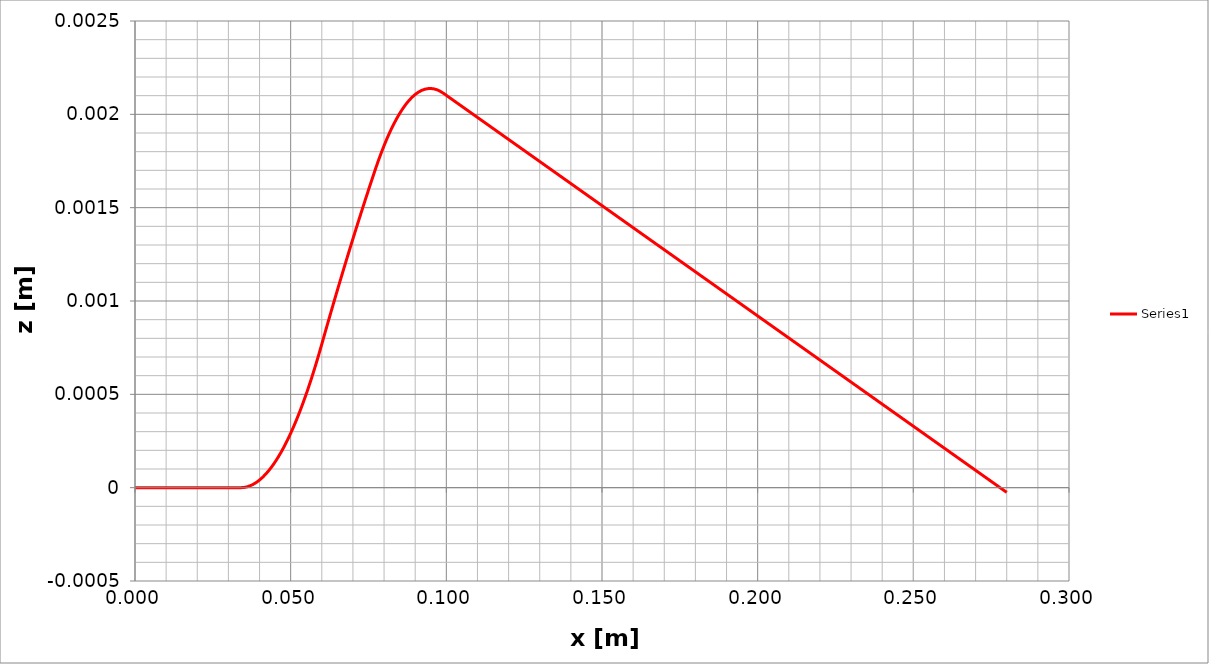
| Category | Series 0 |
|---|---|
| 0.0 | 0 |
| 0.001 | 0 |
| 0.002 | 0 |
| 0.003 | 0 |
| 0.004 | 0 |
| 0.005 | 0 |
| 0.006 | 0 |
| 0.007 | 0 |
| 0.008 | 0 |
| 0.009000000000000001 | 0 |
| 0.010000000000000002 | 0 |
| 0.011000000000000003 | 0 |
| 0.012000000000000004 | 0 |
| 0.013000000000000005 | 0 |
| 0.014000000000000005 | 0 |
| 0.015000000000000006 | 0 |
| 0.016000000000000007 | 0 |
| 0.017000000000000008 | 0 |
| 0.01800000000000001 | 0 |
| 0.01900000000000001 | 0 |
| 0.02000000000000001 | 0 |
| 0.02100000000000001 | 0 |
| 0.022000000000000013 | 0 |
| 0.023000000000000013 | 0 |
| 0.024000000000000014 | 0 |
| 0.025000000000000015 | 0 |
| 0.026000000000000016 | 0 |
| 0.027000000000000017 | 0 |
| 0.028000000000000018 | 0 |
| 0.02900000000000002 | 0 |
| 0.03000000000000002 | 0 |
| 0.03100000000000002 | 0 |
| 0.03200000000000002 | 0 |
| 0.03300000000000002 | 0 |
| 0.03400000000000002 | 0 |
| 0.035000000000000024 | 0 |
| 0.036000000000000025 | 0 |
| 0.037000000000000026 | 0 |
| 0.03800000000000003 | 0 |
| 0.03900000000000003 | 0 |
| 0.04000000000000003 | 0 |
| 0.04100000000000003 | 0 |
| 0.04200000000000003 | 0 |
| 0.04300000000000003 | 0 |
| 0.04400000000000003 | 0 |
| 0.04500000000000003 | 0 |
| 0.046000000000000034 | 0 |
| 0.047000000000000035 | 0 |
| 0.048000000000000036 | 0 |
| 0.04900000000000004 | 0 |
| 0.05000000000000004 | 0 |
| 0.05100000000000004 | 0 |
| 0.05200000000000004 | 0 |
| 0.05300000000000004 | 0 |
| 0.05400000000000004 | 0 |
| 0.05500000000000004 | 0.001 |
| 0.05600000000000004 | 0.001 |
| 0.057000000000000044 | 0.001 |
| 0.058000000000000045 | 0.001 |
| 0.059000000000000045 | 0.001 |
| 0.060000000000000046 | 0.001 |
| 0.06100000000000005 | 0.001 |
| 0.06200000000000005 | 0.001 |
| 0.06300000000000004 | 0.001 |
| 0.06400000000000004 | 0.001 |
| 0.06500000000000004 | 0.001 |
| 0.06600000000000004 | 0.001 |
| 0.06700000000000005 | 0.001 |
| 0.06800000000000005 | 0.001 |
| 0.06900000000000005 | 0.001 |
| 0.07000000000000005 | 0.001 |
| 0.07100000000000005 | 0.001 |
| 0.07200000000000005 | 0.001 |
| 0.07300000000000005 | 0.001 |
| 0.07400000000000005 | 0.002 |
| 0.07500000000000005 | 0.002 |
| 0.07600000000000005 | 0.002 |
| 0.07700000000000005 | 0.002 |
| 0.07800000000000006 | 0.002 |
| 0.07900000000000006 | 0.002 |
| 0.08000000000000006 | 0.002 |
| 0.08100000000000006 | 0.002 |
| 0.08200000000000006 | 0.002 |
| 0.08300000000000006 | 0.002 |
| 0.08400000000000006 | 0.002 |
| 0.08500000000000006 | 0.002 |
| 0.08600000000000006 | 0.002 |
| 0.08700000000000006 | 0.002 |
| 0.08800000000000006 | 0.002 |
| 0.08900000000000007 | 0.002 |
| 0.09000000000000007 | 0.002 |
| 0.09100000000000007 | 0.002 |
| 0.09200000000000007 | 0.002 |
| 0.09300000000000007 | 0.002 |
| 0.09400000000000007 | 0.002 |
| 0.09500000000000007 | 0.002 |
| 0.09600000000000007 | 0.002 |
| 0.09700000000000007 | 0.002 |
| 0.09800000000000007 | 0.002 |
| 0.09900000000000007 | 0.002 |
| 0.10000000000000007 | 0.002 |
| 0.10100000000000008 | 0.002 |
| 0.10200000000000008 | 0.002 |
| 0.10300000000000008 | 0.002 |
| 0.10400000000000008 | 0.002 |
| 0.10500000000000008 | 0.002 |
| 0.10600000000000008 | 0.002 |
| 0.10700000000000008 | 0.002 |
| 0.10800000000000008 | 0.002 |
| 0.10900000000000008 | 0.002 |
| 0.11000000000000008 | 0.002 |
| 0.11100000000000008 | 0.002 |
| 0.11200000000000009 | 0.002 |
| 0.11300000000000009 | 0.002 |
| 0.11400000000000009 | 0.002 |
| 0.11500000000000009 | 0.002 |
| 0.11600000000000009 | 0.002 |
| 0.11700000000000009 | 0.002 |
| 0.11800000000000009 | 0.002 |
| 0.11900000000000009 | 0.002 |
| 0.12000000000000009 | 0.002 |
| 0.1210000000000001 | 0.002 |
| 0.1220000000000001 | 0.002 |
| 0.1230000000000001 | 0.002 |
| 0.1240000000000001 | 0.002 |
| 0.12500000000000008 | 0.002 |
| 0.12600000000000008 | 0.002 |
| 0.12700000000000009 | 0.002 |
| 0.12800000000000009 | 0.002 |
| 0.1290000000000001 | 0.002 |
| 0.1300000000000001 | 0.002 |
| 0.1310000000000001 | 0.002 |
| 0.1320000000000001 | 0.002 |
| 0.1330000000000001 | 0.002 |
| 0.1340000000000001 | 0.002 |
| 0.1350000000000001 | 0.002 |
| 0.1360000000000001 | 0.002 |
| 0.1370000000000001 | 0.002 |
| 0.1380000000000001 | 0.002 |
| 0.1390000000000001 | 0.002 |
| 0.1400000000000001 | 0.002 |
| 0.1410000000000001 | 0.002 |
| 0.1420000000000001 | 0.002 |
| 0.1430000000000001 | 0.002 |
| 0.1440000000000001 | 0.002 |
| 0.1450000000000001 | 0.002 |
| 0.1460000000000001 | 0.002 |
| 0.1470000000000001 | 0.002 |
| 0.1480000000000001 | 0.002 |
| 0.1490000000000001 | 0.002 |
| 0.1500000000000001 | 0.002 |
| 0.1510000000000001 | 0.001 |
| 0.1520000000000001 | 0.001 |
| 0.1530000000000001 | 0.001 |
| 0.1540000000000001 | 0.001 |
| 0.1550000000000001 | 0.001 |
| 0.1560000000000001 | 0.001 |
| 0.1570000000000001 | 0.001 |
| 0.1580000000000001 | 0.001 |
| 0.1590000000000001 | 0.001 |
| 0.16000000000000011 | 0.001 |
| 0.16100000000000012 | 0.001 |
| 0.16200000000000012 | 0.001 |
| 0.16300000000000012 | 0.001 |
| 0.16400000000000012 | 0.001 |
| 0.16500000000000012 | 0.001 |
| 0.16600000000000012 | 0.001 |
| 0.16700000000000012 | 0.001 |
| 0.16800000000000012 | 0.001 |
| 0.16900000000000012 | 0.001 |
| 0.17000000000000012 | 0.001 |
| 0.17100000000000012 | 0.001 |
| 0.17200000000000013 | 0.001 |
| 0.17300000000000013 | 0.001 |
| 0.17400000000000013 | 0.001 |
| 0.17500000000000013 | 0.001 |
| 0.17600000000000013 | 0.001 |
| 0.17700000000000013 | 0.001 |
| 0.17800000000000013 | 0.001 |
| 0.17900000000000013 | 0.001 |
| 0.18000000000000013 | 0.001 |
| 0.18100000000000013 | 0.001 |
| 0.18200000000000013 | 0.001 |
| 0.18300000000000013 | 0.001 |
| 0.18400000000000014 | 0.001 |
| 0.18500000000000014 | 0.001 |
| 0.18600000000000014 | 0.001 |
| 0.18700000000000014 | 0.001 |
| 0.18800000000000014 | 0.001 |
| 0.18900000000000014 | 0.001 |
| 0.19000000000000014 | 0.001 |
| 0.19100000000000014 | 0.001 |
| 0.19200000000000014 | 0.001 |
| 0.19300000000000014 | 0.001 |
| 0.19400000000000014 | 0.001 |
| 0.19500000000000015 | 0.001 |
| 0.19600000000000015 | 0.001 |
| 0.19700000000000015 | 0.001 |
| 0.19800000000000015 | 0.001 |
| 0.19900000000000015 | 0.001 |
| 0.20000000000000015 | 0.001 |
| 0.20100000000000015 | 0.001 |
| 0.20200000000000015 | 0.001 |
| 0.20300000000000015 | 0.001 |
| 0.20400000000000015 | 0.001 |
| 0.20500000000000015 | 0.001 |
| 0.20600000000000016 | 0.001 |
| 0.20700000000000016 | 0.001 |
| 0.20800000000000016 | 0.001 |
| 0.20900000000000016 | 0.001 |
| 0.21000000000000016 | 0.001 |
| 0.21100000000000016 | 0.001 |
| 0.21200000000000016 | 0.001 |
| 0.21300000000000016 | 0.001 |
| 0.21400000000000016 | 0.001 |
| 0.21500000000000016 | 0.001 |
| 0.21600000000000016 | 0.001 |
| 0.21700000000000016 | 0.001 |
| 0.21800000000000017 | 0.001 |
| 0.21900000000000017 | 0.001 |
| 0.22000000000000017 | 0.001 |
| 0.22100000000000017 | 0.001 |
| 0.22200000000000017 | 0.001 |
| 0.22300000000000017 | 0.001 |
| 0.22400000000000017 | 0.001 |
| 0.22500000000000017 | 0.001 |
| 0.22600000000000017 | 0.001 |
| 0.22700000000000017 | 0.001 |
| 0.22800000000000017 | 0.001 |
| 0.22900000000000018 | 0.001 |
| 0.23000000000000018 | 0.001 |
| 0.23100000000000018 | 0.001 |
| 0.23200000000000018 | 0.001 |
| 0.23300000000000018 | 0.001 |
| 0.23400000000000018 | 0.001 |
| 0.23500000000000018 | 0.001 |
| 0.23600000000000018 | 0 |
| 0.23700000000000018 | 0 |
| 0.23800000000000018 | 0 |
| 0.23900000000000018 | 0 |
| 0.24000000000000019 | 0 |
| 0.2410000000000002 | 0 |
| 0.2420000000000002 | 0 |
| 0.2430000000000002 | 0 |
| 0.2440000000000002 | 0 |
| 0.2450000000000002 | 0 |
| 0.2460000000000002 | 0 |
| 0.2470000000000002 | 0 |
| 0.2480000000000002 | 0 |
| 0.2490000000000002 | 0 |
| 0.25000000000000017 | 0 |
| 0.25100000000000017 | 0 |
| 0.25200000000000017 | 0 |
| 0.25300000000000017 | 0 |
| 0.25400000000000017 | 0 |
| 0.25500000000000017 | 0 |
| 0.25600000000000017 | 0 |
| 0.2570000000000002 | 0 |
| 0.2580000000000002 | 0 |
| 0.2590000000000002 | 0 |
| 0.2600000000000002 | 0 |
| 0.2610000000000002 | 0 |
| 0.2620000000000002 | 0 |
| 0.2630000000000002 | 0 |
| 0.2640000000000002 | 0 |
| 0.2650000000000002 | 0 |
| 0.2660000000000002 | 0 |
| 0.2670000000000002 | 0 |
| 0.2680000000000002 | 0 |
| 0.2690000000000002 | 0 |
| 0.2700000000000002 | 0 |
| 0.2710000000000002 | 0 |
| 0.2720000000000002 | 0 |
| 0.2730000000000002 | 0 |
| 0.2740000000000002 | 0 |
| 0.2750000000000002 | 0 |
| 0.2760000000000002 | 0 |
| 0.2770000000000002 | 0 |
| 0.2780000000000002 | 0 |
| 0.2790000000000002 | 0 |
| 0.2800000000000002 | 0 |